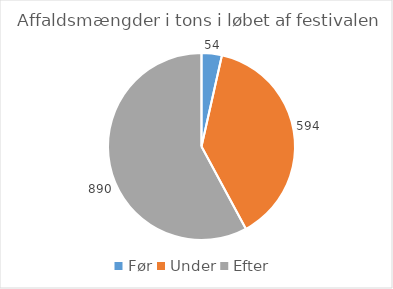
| Category | Affaldsmængde i tons |
|---|---|
| Før | 54 |
| Under | 594 |
| Efter | 890 |